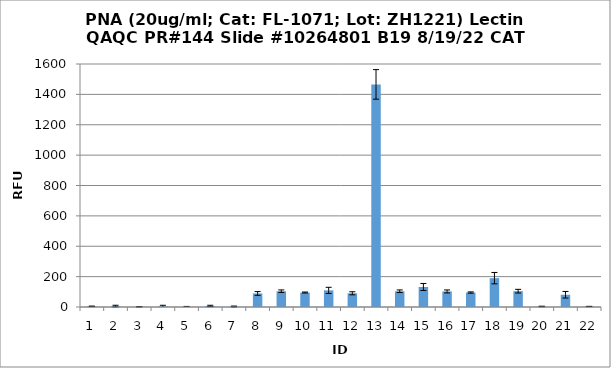
| Category | Series 0 |
|---|---|
| 0 | 4.5 |
| 1 | 6 |
| 2 | 1.25 |
| 3 | 5 |
| 4 | 1.5 |
| 5 | 7 |
| 6 | 3.25 |
| 7 | 89.25 |
| 8 | 104 |
| 9 | 95.25 |
| 10 | 109.5 |
| 11 | 90.25 |
| 12 | 1465.75 |
| 13 | 103.75 |
| 14 | 131.75 |
| 15 | 102.5 |
| 16 | 95.25 |
| 17 | 190 |
| 18 | 104.25 |
| 19 | 3.5 |
| 20 | 80.75 |
| 21 | 3.5 |